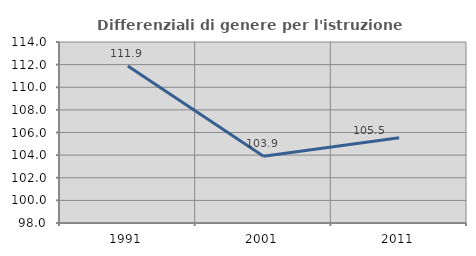
| Category | Differenziali di genere per l'istruzione superiore |
|---|---|
| 1991.0 | 111.878 |
| 2001.0 | 103.891 |
| 2011.0 | 105.537 |